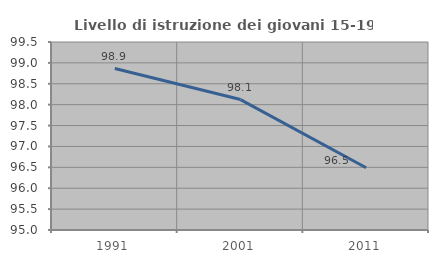
| Category | Livello di istruzione dei giovani 15-19 anni |
|---|---|
| 1991.0 | 98.865 |
| 2001.0 | 98.122 |
| 2011.0 | 96.491 |